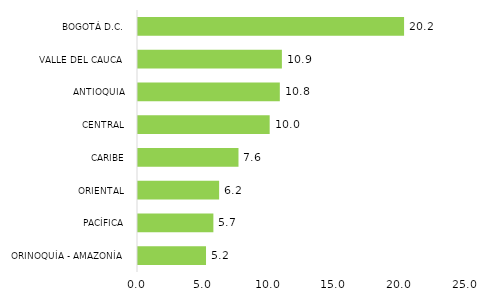
| Category | Series 0 |
|---|---|
| ORINOQUÍA - AMAZONÍA | 5.169 |
| PACÍFICA | 5.728 |
| ORIENTAL | 6.164 |
| CARIBE | 7.636 |
| CENTRAL | 10.006 |
| ANTIOQUIA | 10.776 |
| VALLE DEL CAUCA | 10.934 |
| BOGOTÁ D.C. | 20.218 |